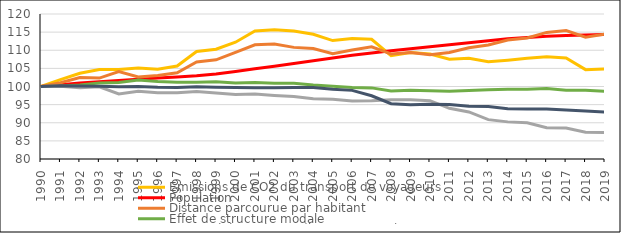
| Category | Émissions de CO2 du transport de voyageurs | Population | Distance parcourue par habitant | Effet de structure modale | Intensité énergétique (hors structure) | Contenu carbone de l'énergie (hors structure) |
|---|---|---|---|---|---|---|
| 1990.0 | 100 | 100 | 100 | 100 | 100 | 100 |
| 1991.0 | 101.879 | 100.47 | 101.049 | 100.132 | 100.044 | 100.173 |
| 1992.0 | 103.659 | 100.936 | 102.458 | 100.449 | 99.677 | 100.109 |
| 1993.0 | 104.684 | 101.337 | 102.319 | 100.981 | 99.926 | 100.055 |
| 1994.0 | 104.708 | 101.675 | 104.09 | 101.108 | 97.925 | 99.925 |
| 1995.0 | 105.097 | 102.002 | 102.651 | 101.772 | 98.657 | 99.968 |
| 1996.0 | 104.791 | 102.323 | 103.049 | 101.373 | 98.256 | 99.777 |
| 1997.0 | 105.647 | 102.643 | 103.77 | 101.163 | 98.285 | 99.758 |
| 1998.0 | 109.639 | 102.978 | 106.781 | 101.178 | 98.637 | 99.908 |
| 1999.0 | 110.271 | 103.471 | 107.366 | 101.301 | 98.195 | 99.786 |
| 2000.0 | 112.226 | 104.15 | 109.424 | 100.962 | 97.782 | 99.749 |
| 2001.0 | 115.304 | 104.88 | 111.504 | 101.07 | 97.919 | 99.625 |
| 2002.0 | 115.679 | 105.616 | 111.715 | 100.87 | 97.531 | 99.656 |
| 2003.0 | 115.284 | 106.339 | 110.793 | 100.927 | 97.222 | 99.723 |
| 2004.0 | 114.393 | 107.099 | 110.452 | 100.393 | 96.601 | 99.713 |
| 2005.0 | 112.667 | 107.887 | 109.029 | 100.091 | 96.449 | 99.218 |
| 2006.0 | 113.213 | 108.621 | 110.049 | 99.712 | 96.008 | 98.933 |
| 2007.0 | 113.008 | 109.269 | 110.926 | 99.619 | 96.041 | 97.45 |
| 2008.0 | 108.494 | 109.86 | 108.959 | 98.766 | 96.328 | 95.267 |
| 2009.0 | 109.395 | 110.416 | 109.376 | 98.991 | 96.332 | 94.99 |
| 2010.0 | 108.943 | 110.949 | 108.739 | 98.831 | 96.079 | 95.098 |
| 2011.0 | 107.517 | 111.487 | 109.4 | 98.673 | 93.978 | 95.062 |
| 2012.0 | 107.766 | 112.041 | 110.688 | 98.871 | 92.972 | 94.533 |
| 2013.0 | 106.83 | 112.615 | 111.47 | 99.109 | 90.864 | 94.501 |
| 2014.0 | 107.273 | 113.147 | 112.818 | 99.227 | 90.24 | 93.85 |
| 2015.0 | 107.821 | 113.536 | 113.368 | 99.251 | 89.976 | 93.803 |
| 2016.0 | 108.178 | 113.834 | 114.927 | 99.474 | 88.612 | 93.809 |
| 2017.0 | 107.893 | 114.071 | 115.435 | 98.983 | 88.547 | 93.485 |
| 2018.0 | 104.653 | 114.232 | 113.604 | 98.999 | 87.387 | 93.216 |
| 2019.0 | 104.807 | 114.374 | 114.434 | 98.708 | 87.274 | 92.955 |